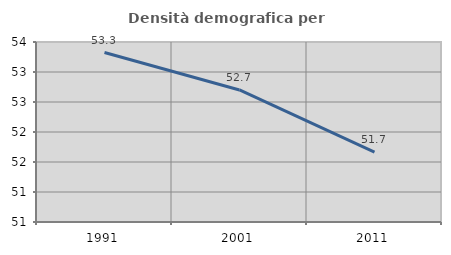
| Category | Densità demografica |
|---|---|
| 1991.0 | 53.325 |
| 2001.0 | 52.701 |
| 2011.0 | 51.666 |